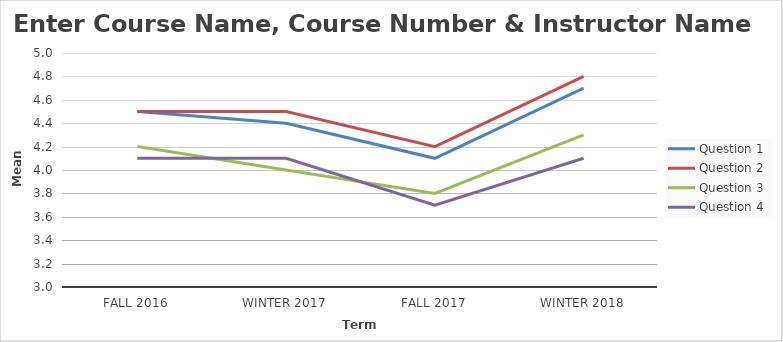
| Category | Question 1 | Question 2 | Question 3 | Question 4 |
|---|---|---|---|---|
| Fall 2016 | 4.5 | 4.5 | 4.2 | 4.1 |
| Winter 2017 | 4.4 | 4.5 | 4 | 4.1 |
| Fall 2017 | 4.1 | 4.2 | 3.8 | 3.7 |
| Winter 2018 | 4.7 | 4.8 | 4.3 | 4.1 |